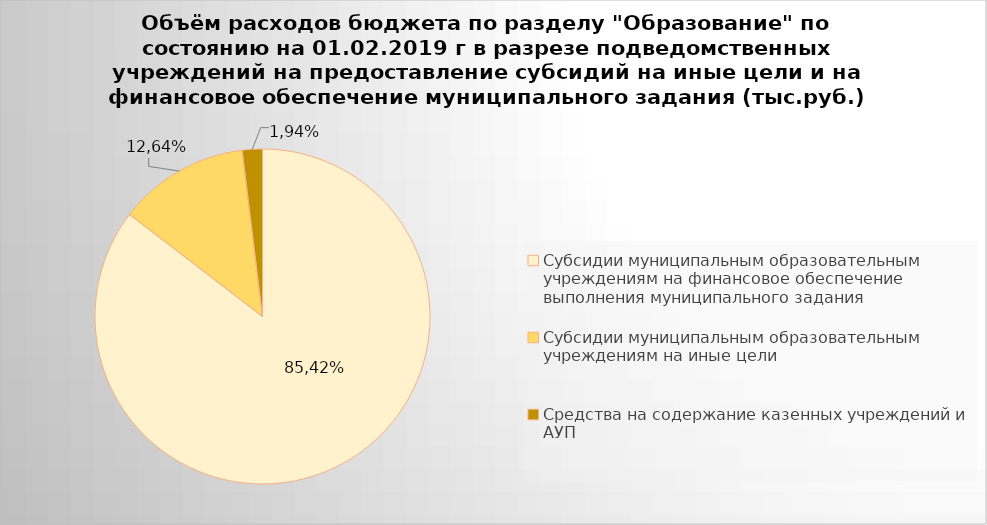
| Category | Series 0 |
|---|---|
| Субсидии муниципальным образовательным учреждениям на финансовое обеспечение выполнения муниципального задания | 4075608.83 |
| Субсидии муниципальным образовательным учреждениям на иные цели | 603036.27 |
| Средства на содержание казенных учреждений и АУП | 92571.3 |